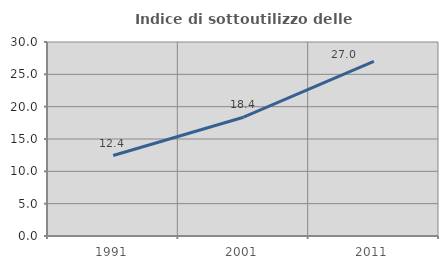
| Category | Indice di sottoutilizzo delle abitazioni  |
|---|---|
| 1991.0 | 12.442 |
| 2001.0 | 18.37 |
| 2011.0 | 27.007 |